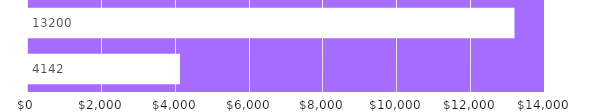
| Category | ANNUAL TOTALS |
|---|---|
| INCOME | 4142 |
| EXPENDITURES | 13200 |